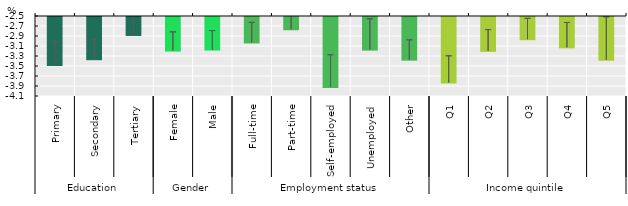
| Category | Estimated Coefficient |
|---|---|
| 0 | -3.48 |
| 1 | -3.364 |
| 2 | -2.879 |
| 3 | -3.192 |
| 4 | -3.171 |
| 5 | -3.029 |
| 6 | -2.765 |
| 7 | -3.918 |
| 8 | -3.172 |
| 9 | -3.373 |
| 10 | -3.831 |
| 11 | -3.198 |
| 12 | -2.964 |
| 13 | -3.127 |
| 14 | -3.375 |